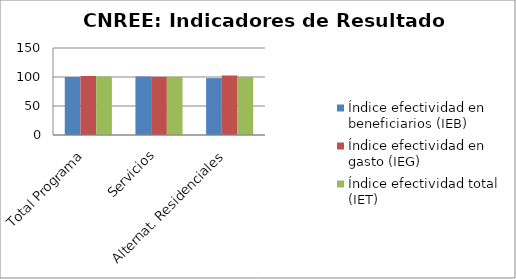
| Category | Índice efectividad en beneficiarios (IEB) | Índice efectividad en gasto (IEG)  | Índice efectividad total (IET) |
|---|---|---|---|
| Total Programa | 100.028 | 101.823 | 100.925 |
| Servicios | 100.773 | 100.311 | 100.542 |
| Alternat. Residenciales | 98.055 | 102.54 | 100.298 |